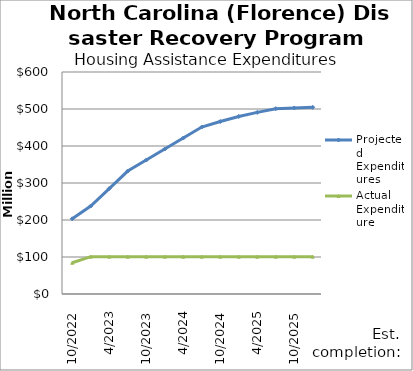
| Category | Projected Expenditures | Actual Expenditure |
|---|---|---|
| 10/2022 | 203220178 | 84420288.3 |
| 1/2023 | 237813733 | 100936743.25 |
| 4/2023 | 285019896 | 100936743.25 |
| 7/2023 | 332226060 | 100936743.25 |
| 10/2023 | 361986192 | 100936743.25 |
| 1/2024 | 391746324 | 100936743.25 |
| 4/2024 | 421506456 | 100936743.25 |
| 7/2024 | 451266588 | 100936743.25 |
| 10/2024 | 466104010 | 100936743.25 |
| 1/2025 | 479856144 | 100936743.25 |
| 4/2025 | 490821498 | 100936743.25 |
| 7/2025 | 500860412 | 100936743.25 |
| 10/2025 | 502759666 | 100936743.25 |
| 1/2026 | 504658920 | 100936743.25 |